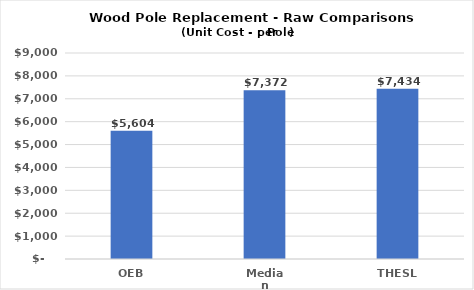
| Category | Series 0 |
|---|---|
| OEB | 5604 |
| Median | 7371.762 |
| THESL | 7434 |